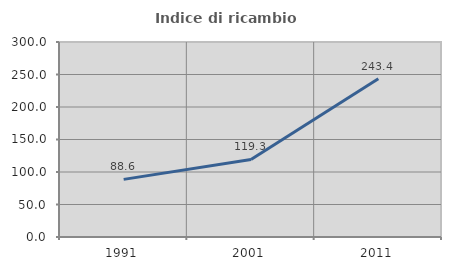
| Category | Indice di ricambio occupazionale  |
|---|---|
| 1991.0 | 88.641 |
| 2001.0 | 119.267 |
| 2011.0 | 243.448 |